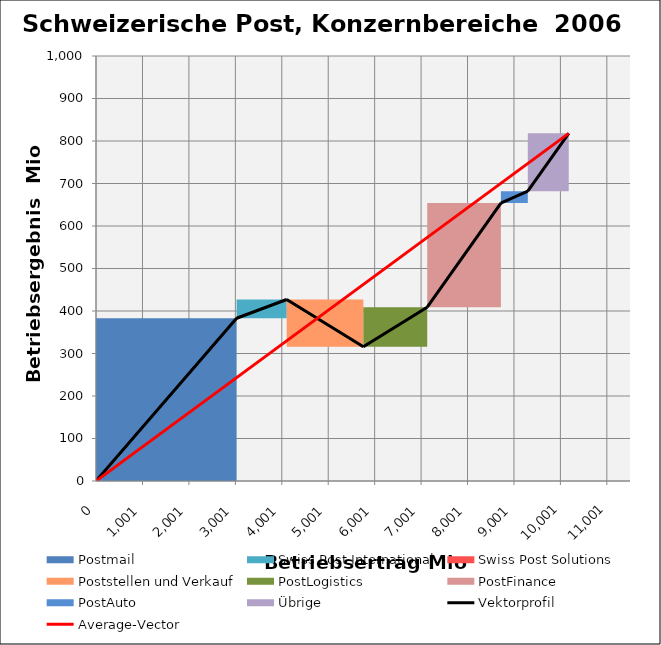
| Category | transparent | Postmail | Swiss Post International | Swiss Post Solutions | Poststellen und Verkauf | PostLogistics | PostFinance | PostAuto | Übrige | Border right & top |
|---|---|---|---|---|---|---|---|---|---|---|
| 0.0 | 0 | 383 | 0 | 0 | 0 | 0 | 0 | 0 | 0 | 0 |
| 3028.0 | 0 | 383 | 0 | 0 | 0 | 0 | 0 | 0 | 0 | 0 |
| 3028.0 | 383 | 0 | 44 | 0 | 0 | 0 | 0 | 0 | 0 | 0 |
| 4107.0 | 383 | 0 | 44 | 0 | 0 | 0 | 0 | 0 | 0 | 0 |
| 4107.0 | 427 | 0 | 0 | 0 | 0 | 0 | 0 | 0 | 0 | 0 |
| 4107.0 | 427 | 0 | 0 | 0 | 0 | 0 | 0 | 0 | 0 | 0 |
| 4107.0 | 427 | 0 | 0 | 0 | -111 | 0 | 0 | 0 | 0 | 0 |
| 5758.0 | 427 | 0 | 0 | 0 | -111 | 0 | 0 | 0 | 0 | 0 |
| 5758.0 | 316 | 0 | 0 | 0 | 0 | 93 | 0 | 0 | 0 | 0 |
| 7133.0 | 316 | 0 | 0 | 0 | 0 | 93 | 0 | 0 | 0 | 0 |
| 7133.0 | 409 | 0 | 0 | 0 | 0 | 0 | 245 | 0 | 0 | 0 |
| 8720.0 | 409 | 0 | 0 | 0 | 0 | 0 | 245 | 0 | 0 | 0 |
| 8720.0 | 654 | 0 | 0 | 0 | 0 | 0 | 0 | 28 | 0 | 0 |
| 9299.0 | 654 | 0 | 0 | 0 | 0 | 0 | 0 | 28 | 0 | 0 |
| 9299.0 | 682 | 0 | 0 | 0 | 0 | 0 | 0 | 0 | 136 | 0 |
| 10181.0 | 682 | 0 | 0 | 0 | 0 | 0 | 0 | 0 | 136 | 0 |
| 10181.0 | 818 | 0 | 0 | 0 | 0 | 0 | 0 | 0 | 0 | 0 |
| 10181.0 | 818 | 0 | 0 | 0 | 0 | 0 | 0 | 0 | 0 | 0 |
| 10181.0 | 818 | 0 | 0 | 0 | 0 | 0 | 0 | 0 | 0 | 0 |
| 10181.0 | 818 | 0 | 0 | 0 | 0 | 0 | 0 | 0 | 0 | 0 |
| 10181.0 | 818 | 0 | 0 | 0 | 0 | 0 | 0 | 0 | 0 | 82 |
| 11500.0 | 818 | 0 | 0 | 0 | 0 | 0 | 0 | 0 | 0 | 82 |
| 11500.0 | 818 | 0 | 0 | 0 | 0 | 0 | 0 | 0 | 0 | 82 |